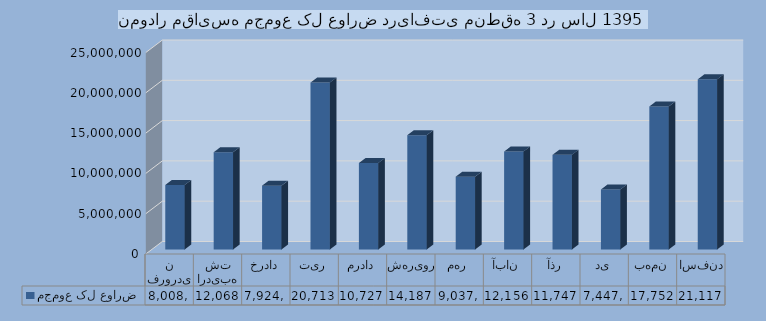
| Category | مجموع کل عوارض |
|---|---|
| فروردین | 8008284 |
| اردیبهشت | 12068757 |
| خرداد | 7924462 |
| تیر | 20713003 |
| مرداد | 10727704 |
| شهریور | 14187809 |
| مهر | 9037819 |
| آبان | 12156762 |
| آذر | 11747279 |
| دی | 7447758 |
| بهمن | 17752059 |
| اسفند | 21117191 |